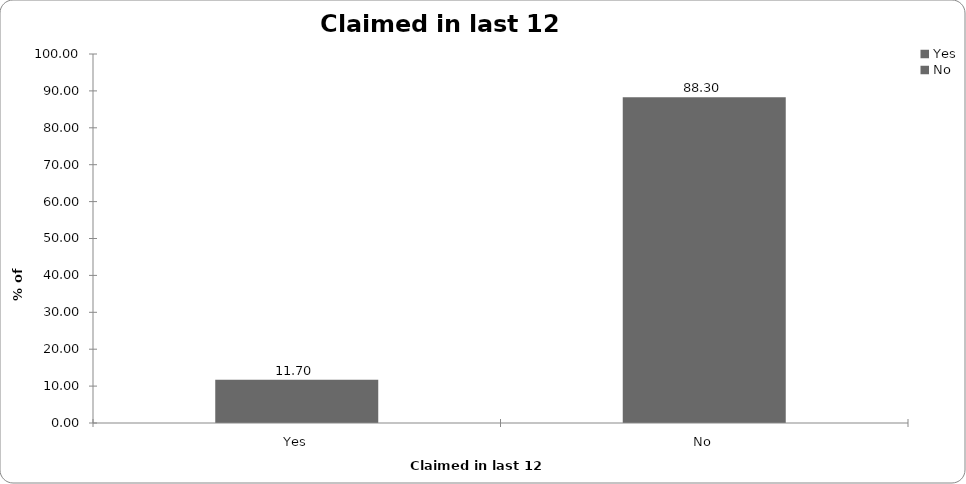
| Category | Claimed in last 12 months |
|---|---|
| Yes | 11.7 |
| No | 88.3 |